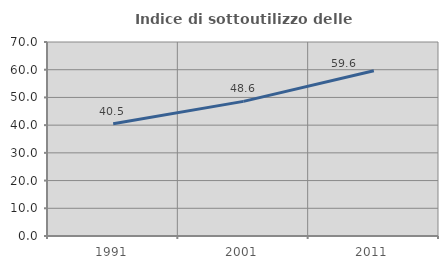
| Category | Indice di sottoutilizzo delle abitazioni  |
|---|---|
| 1991.0 | 40.496 |
| 2001.0 | 48.571 |
| 2011.0 | 59.612 |